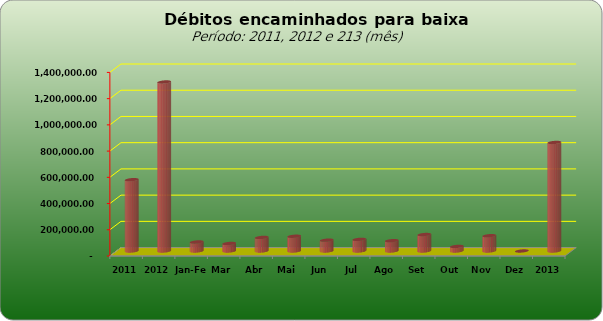
| Category |  543.796,20   1.288.982,12   68.983,48   57.649,63   103.629,52   112.546,24   82.743,05   88.789,93   78.810,72   125.756,48   34.869,40   116.804,43   -     827.730,50  |
|---|---|
| 2011 | 543796.2 |
| 2012 | 1288982.12 |
| Jan-Fev | 68983.48 |
| Mar | 57649.63 |
| Abr | 103629.52 |
| Mai | 112546.24 |
| Jun | 82743.05 |
| Jul | 88789.93 |
| Ago | 78810.72 |
| Set | 125756.48 |
| Out | 34869.4 |
| Nov | 116804.43 |
| Dez | 0 |
| 2013 | 827730.5 |